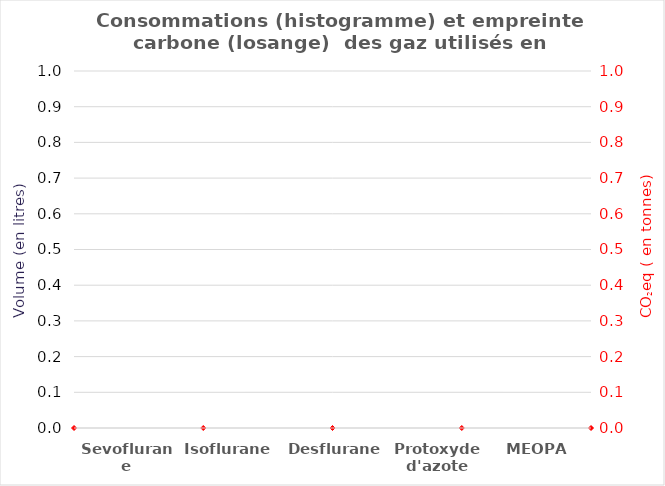
| Category | Volume de gaz "consommé" (litres) |
|---|---|
| Sevoflurane | 0 |
| Isoflurane | 0 |
| Desflurane | 0 |
| Protoxyde d'azote | 0 |
| MEOPA | 0 |